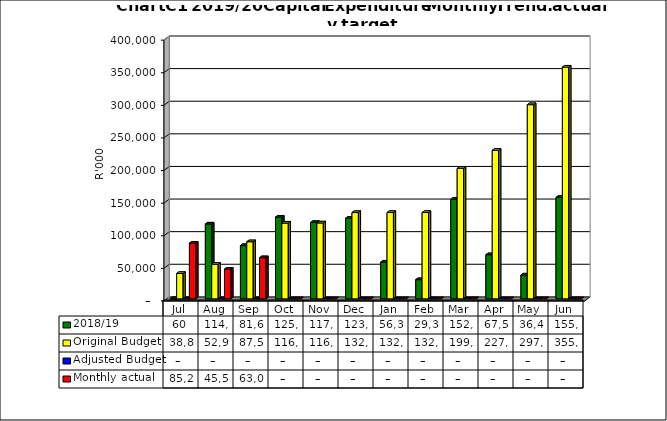
| Category | 2018/19 | Original Budget | Adjusted Budget | Monthly actual |
|---|---|---|---|---|
| Jul | 59892 | 38885000 | 0 | 85297669.12 |
| Aug | 114658356.076 | 52927000 | 0 | 45515291.767 |
| Sep | 81613647.633 | 87521000 | 0 | 63024484.609 |
| Oct | 125253452.407 | 116093000 | 0 | 0 |
| Nov | 117057421.925 | 116300000 | 0 | 0 |
| Dec | 123680771.708 | 132266000 | 0 | 0 |
| Jan | 56304819.372 | 132336000 | 0 | 0 |
| Feb | 29352943.088 | 132336000 | 0 | 0 |
| Mar | 152645868.565 | 199883000 | 0 | 0 |
| Apr | 67570203.105 | 227676000 | 0 | 0 |
| May | 36486409.167 | 297703000 | 0 | 0 |
| Jun | 155412588.422 | 355259999.6 | 0 | 0 |